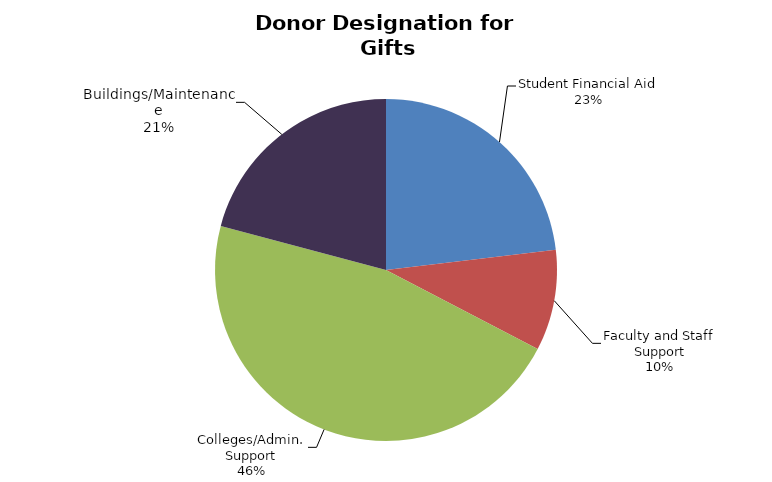
| Category | Series 0 |
|---|---|
| Student Financial Aid | 0.231 |
| Faculty and Staff Support | 0.095 |
| Colleges/Admin. Support | 0.465 |
| Buildings/Maintenance | 0.209 |